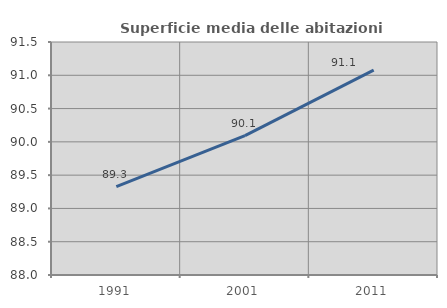
| Category | Superficie media delle abitazioni occupate |
|---|---|
| 1991.0 | 89.327 |
| 2001.0 | 90.094 |
| 2011.0 | 91.076 |